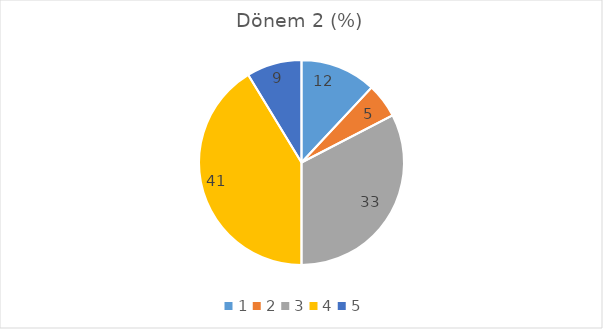
| Category | Dönem 2 (%) |
|---|---|
| 1.0 | 11.957 |
| 2.0 | 5.435 |
| 3.0 | 32.609 |
| 4.0 | 41.304 |
| 5.0 | 8.696 |